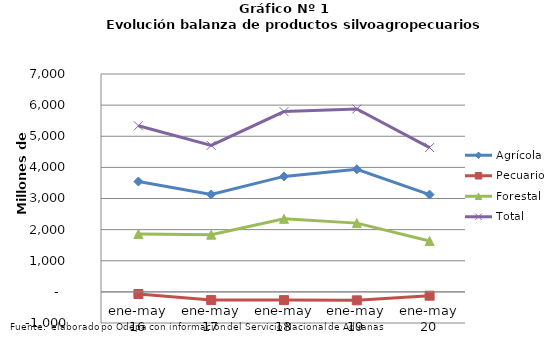
| Category | Agrícola | Pecuario | Forestal | Total |
|---|---|---|---|---|
| ene-may 16 | 3545419 | -68555 | 1858509 | 5335373 |
| ene-may 17 | 3128744 | -259752 | 1838353 | 4707345 |
| ene-may 18 | 3709574 | -264698 | 2347472 | 5792348 |
| ene-may 19 | 3939288 | -271947 | 2208949 | 5876290 |
| ene-may 20 | 3125115 | -122920 | 1633901 | 4636096 |